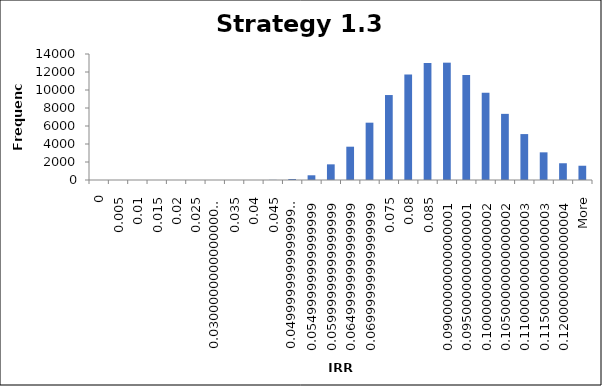
| Category | Frequency |
|---|---|
| 0 | 0 |
| 0.005 | 0 |
| 0.01 | 0 |
| 0.015 | 0 |
| 0.02 | 0 |
| 0.025 | 1 |
| 0.03 | 2 |
| 0.035 | 1 |
| 0.04 | 0 |
| 0.045 | 16 |
| 0.05 | 114 |
| 0.055 | 524 |
| 0.06 | 1740 |
| 0.065 | 3701 |
| 0.07 | 6369 |
| 0.075 | 9440 |
| 0.08 | 11728 |
| 0.085 | 12989 |
| 0.09 | 13037 |
| 0.095 | 11673 |
| 0.1 | 9696 |
| 0.105 | 7349 |
| 0.11 | 5102 |
| 0.115 | 3074 |
| 0.12 | 1861 |
| More | 1585 |